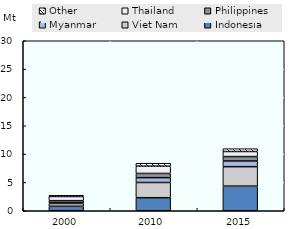
| Category | Indonesia | Viet Nam | Myanmar | Philippines | Thailand | Other |
|---|---|---|---|---|---|---|
| 2000.0 | 788.5 | 498.517 | 98.912 | 393.863 | 738.155 | 208.269 |
| 2010.0 | 2304.828 | 2683.096 | 850.697 | 744.695 | 1286.122 | 515.451 |
| 2015.0 | 4342.465 | 3438.378 | 997.306 | 781.798 | 897.096 | 497.705 |